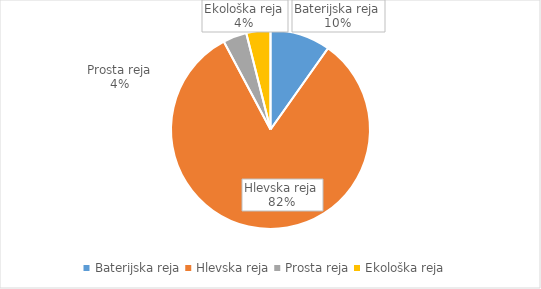
| Category | Količina kosov jajc |
|---|---|
| Baterijska reja | 260776 |
| Hlevska reja | 2193512 |
| Prosta reja | 102352 |
| Ekološka reja | 104454 |